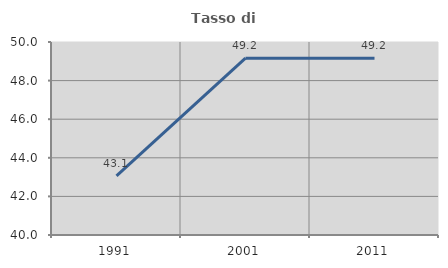
| Category | Tasso di occupazione   |
|---|---|
| 1991.0 | 43.059 |
| 2001.0 | 49.164 |
| 2011.0 | 49.162 |